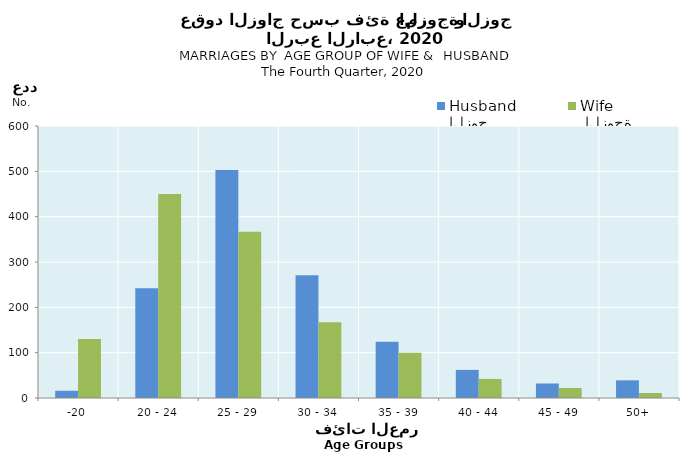
| Category | الزوج
Husband |  الزوجة
Wife |
|---|---|---|
| -20 | 16 | 130 |
| 20 - 24 | 242 | 450 |
| 25 - 29 | 503 | 367 |
| 30 - 34 | 271 | 167 |
| 35 - 39 | 124 | 100 |
| 40 - 44 | 62 | 42 |
| 45 - 49 | 32 | 22 |
| 50+ | 39 | 11 |